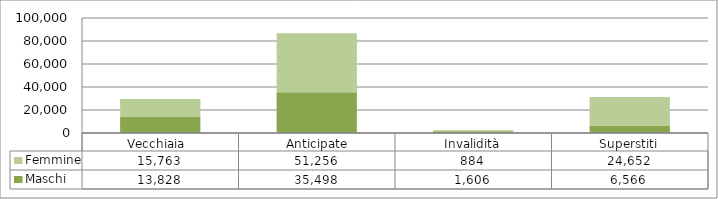
| Category | Maschi | Femmine |
|---|---|---|
| Vecchiaia  | 13828 | 15763 |
|  Anticipate | 35498 | 51256 |
| Invalidità | 1606 | 884 |
| Superstiti | 6566 | 24652 |